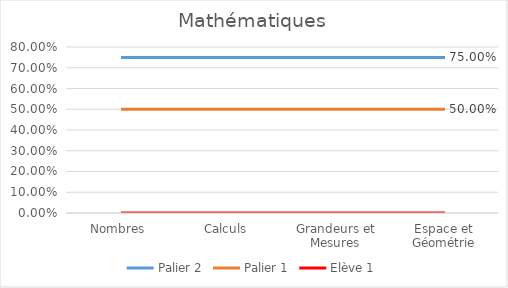
| Category | Palier 2 | Palier 1 | Elève 1 |
|---|---|---|---|
| Nombres | 0.75 | 0.5 | 0 |
| Calculs | 0.75 | 0.5 | 0 |
| Grandeurs et Mesures | 0.75 | 0.5 | 0 |
| Espace et Géométrie | 0.75 | 0.5 | 0 |